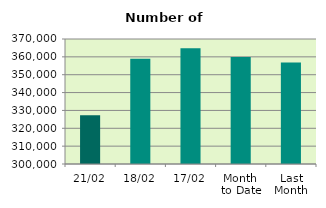
| Category | Series 0 |
|---|---|
| 21/02 | 327346 |
| 18/02 | 359008 |
| 17/02 | 364790 |
| Month 
to Date | 359982.267 |
| Last
Month | 356827.619 |